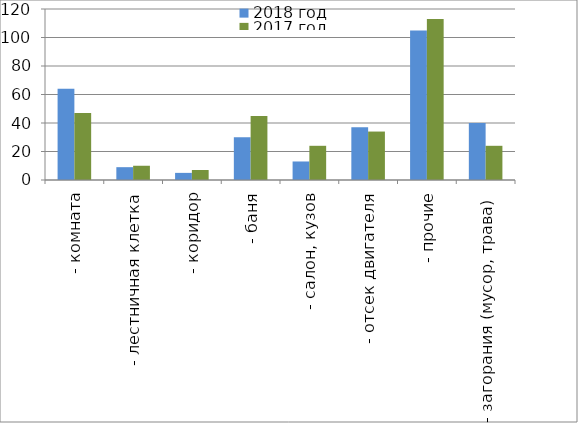
| Category | 2018 год | 2017 год |
|---|---|---|
|  - комната | 64 | 47 |
|  - лестничная клетка | 9 | 10 |
|  - коридор | 5 | 7 |
|  - баня | 30 | 45 |
|  - салон, кузов | 13 | 24 |
|  - отсек двигателя | 37 | 34 |
| - прочие | 105 | 113 |
| - загорания (мусор, трава)  | 40 | 24 |